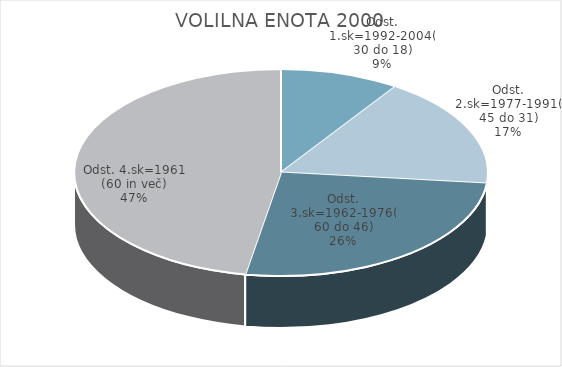
| Category | VOLILNA ENOTA 2000 |
|---|---|
| Odst. 1.sk=1992-2004(30 do 18) | 3.91 |
| Odst. 2.sk=1977-1991(45 do 31) | 7.25 |
| Odst. 3.sk=1962-1976(60 do 46) | 10.89 |
| Odst. 4.sk=1961 (60 in več) | 19.74 |